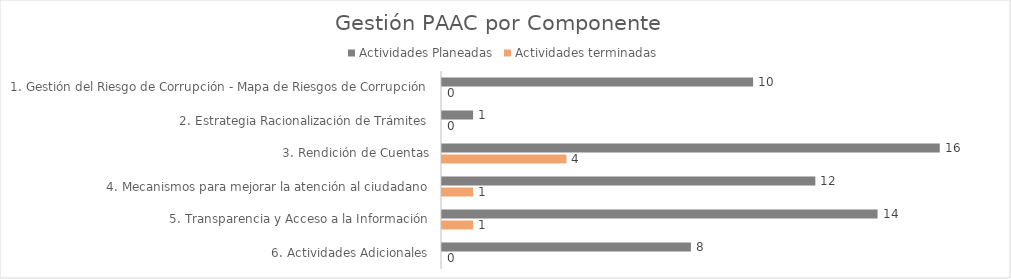
| Category | Actividades Planeadas | Actividades terminadas |
|---|---|---|
| 1. Gestión del Riesgo de Corrupción - Mapa de Riesgos de Corrupción | 10 | 0 |
| 2. Estrategia Racionalización de Trámites | 1 | 0 |
| 3. Rendición de Cuentas | 16 | 4 |
| 4. Mecanismos para mejorar la atención al ciudadano | 12 | 1 |
| 5. Transparencia y Acceso a la Información | 14 | 1 |
| 6. Actividades Adicionales | 8 | 0 |